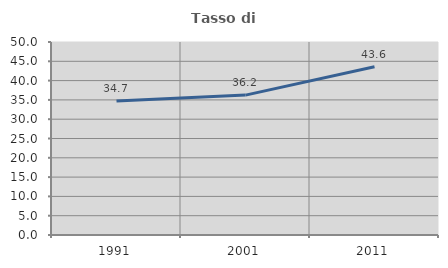
| Category | Tasso di occupazione   |
|---|---|
| 1991.0 | 34.694 |
| 2001.0 | 36.241 |
| 2011.0 | 43.609 |